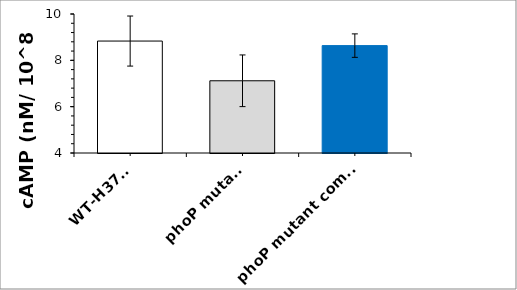
| Category | Concentrations in nmol / 10^8 cells |
|---|---|
| WT-H37Rv | 8.832 |
| phoP mutant  | 7.117 |
| phoP mutant complemented  | 8.635 |